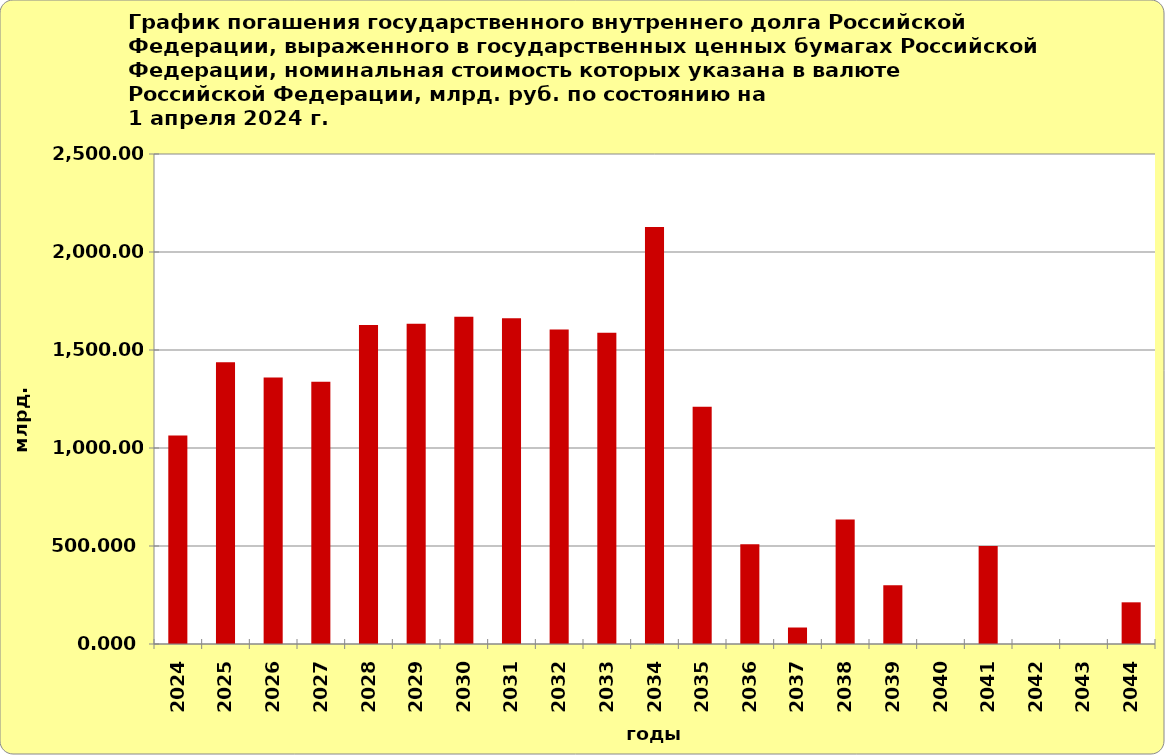
| Category | Series 1 |
|---|---|
| 2024.0 | 1064.355 |
| 2025.0 | 1437.617 |
| 2026.0 | 1360.189 |
| 2027.0 | 1337.703 |
| 2028.0 | 1627.526 |
| 2029.0 | 1633.774 |
| 2030.0 | 1669.255 |
| 2031.0 | 1661.564 |
| 2032.0 | 1605.209 |
| 2033.0 | 1588.039 |
| 2034.0 | 2127.986 |
| 2035.0 | 1210.91 |
| 2036.0 | 508.553 |
| 2037.0 | 84.139 |
| 2038.0 | 635.05 |
| 2039.0 | 300 |
| 2040.0 | 0 |
| 2041.0 | 500 |
| 2042.0 | 0 |
| 2043.0 | 0 |
| 2044.0 | 212.636 |